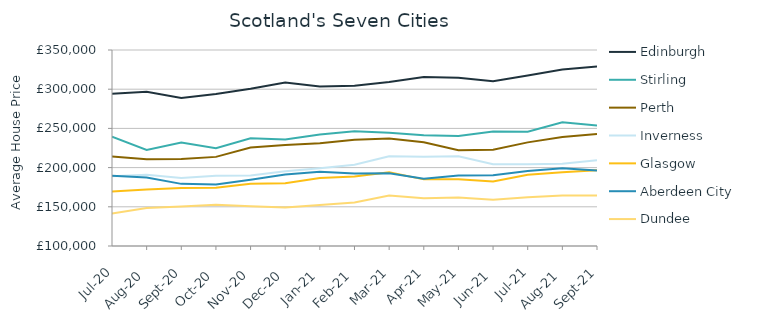
| Category | Edinburgh | Stirling | Perth | Inverness | Glasgow | Aberdeen City | Dundee |
|---|---|---|---|---|---|---|---|
| 2020-07-01 | 294060.807 | 239315.35 | 214228.893 | 188932.995 | 169557.614 | 189625.385 | 141564.902 |
| 2020-08-01 | 296749.743 | 222619.493 | 210691.134 | 190723.767 | 171910.048 | 187376.969 | 148449.903 |
| 2020-09-01 | 288834.752 | 232059.399 | 210950.234 | 186854.062 | 174105.42 | 179259.058 | 150287.377 |
| 2020-10-01 | 293964.456 | 224725.277 | 213674.387 | 189754.247 | 174259.922 | 178388.136 | 152497.741 |
| 2020-11-01 | 300687.993 | 237329.769 | 225630.679 | 189933.107 | 179470.365 | 184437.771 | 150697.836 |
| 2020-12-01 | 308592.141 | 235763.671 | 228875.884 | 195362.201 | 180048.833 | 191160.342 | 149062.193 |
| 2021-01-01 | 303566.61 | 242238.402 | 231104.013 | 199050.519 | 186787.928 | 194746.382 | 152378.215 |
| 2021-02-01 | 304428.377 | 246511.879 | 235622.779 | 203545.038 | 188633.199 | 192421.225 | 155388.563 |
| 2021-03-01 | 309230.238 | 244430.258 | 237042.464 | 214399.122 | 194069.579 | 192788.448 | 164288.106 |
| 2021-04-01 | 315674.384 | 241338.33 | 232445.911 | 213930.393 | 184991.665 | 185754.555 | 160953.716 |
| 2021-05-01 | 314554.123 | 240252.021 | 222117.85 | 214543.655 | 185245.632 | 189983.922 | 161711.652 |
| 2021-06-01 | 310222.197 | 246082.045 | 222870.517 | 204274.527 | 182241.029 | 190284.335 | 159138.452 |
| 2021-07-01 | 317591.247 | 245871.626 | 232179.024 | 204312.652 | 190888.547 | 195686.934 | 162144.3 |
| 2021-08-01 | 325152.548 | 257738.927 | 239079.838 | 205026.965 | 194025.387 | 199319.359 | 164553.894 |
| 2021-09-01 | 329067.843 | 253776.967 | 242758.628 | 209489.007 | 196682.415 | 196139.227 | 164283.705 |